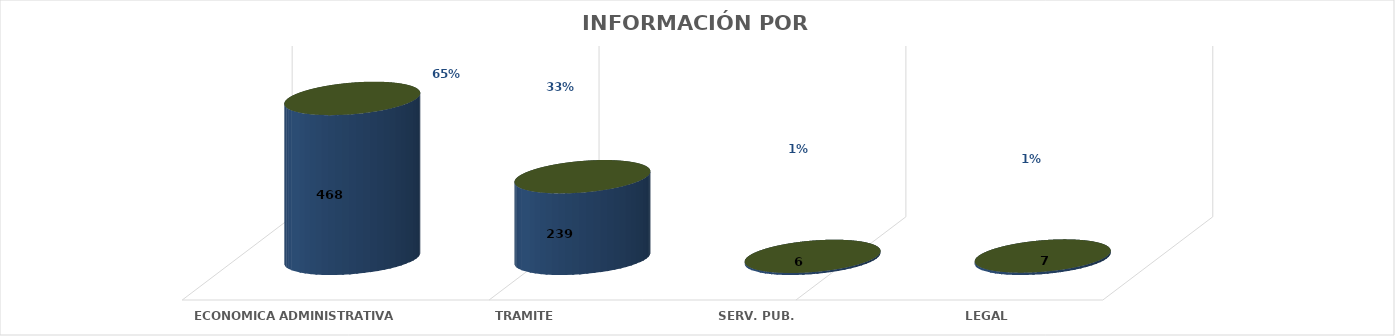
| Category | Series 0 | Series 1 | Series 2 | Series 3 | Series 4 |
|---|---|---|---|---|---|
| ECONOMICA ADMINISTRATIVA |  |  |  | 468 | 0.65 |
| TRAMITE |  |  |  | 239 | 0.332 |
| SERV. PUB. |  |  |  | 6 | 0.008 |
| LEGAL |  |  |  | 7 | 0.01 |